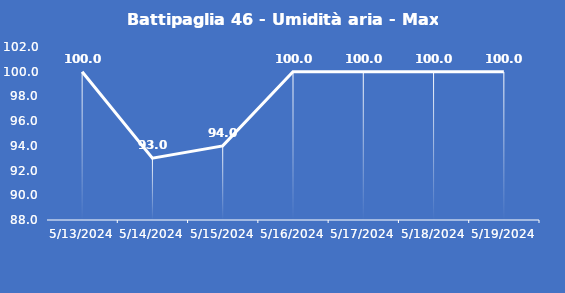
| Category | Battipaglia 46 - Umidità aria - Max (%) |
|---|---|
| 5/13/24 | 100 |
| 5/14/24 | 93 |
| 5/15/24 | 94 |
| 5/16/24 | 100 |
| 5/17/24 | 100 |
| 5/18/24 | 100 |
| 5/19/24 | 100 |